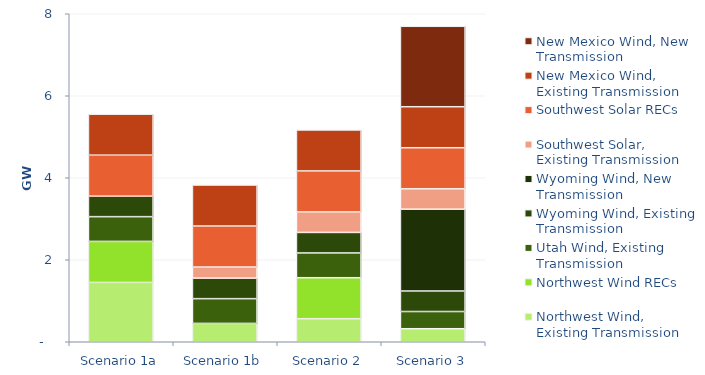
| Category | Northwest Wind, Existing Transmission | Northwest Wind RECs | Utah Wind, Existing Transmission | Wyoming Wind, Existing Transmission | Wyoming Wind, New Transmission | Southwest Solar, Existing Transmission | Southwest Solar RECs | New Mexico Wind, Existing Transmission | New Mexico Wind, New Transmission |
|---|---|---|---|---|---|---|---|---|---|
| Scenario 1a | 1447.083 | 1000 | 603.999 | 500 | 0 | 0 | 1000 | 1000 | 0 |
| Scenario 1b | 447.083 | 0 | 603.999 | 500 | 0 | 272 | 1000 | 1000 | 0 |
| Scenario 2 | 562.083 | 1000 | 603.999 | 500 | 0 | 500 | 1000 | 1000 | 0 |
| Scenario 3 | 317.674 | 0 | 419.982 | 500 | 1994.668 | 500 | 1000 | 1000 | 1961.885 |